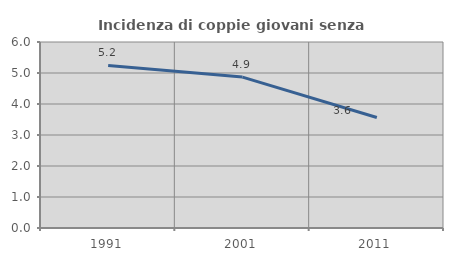
| Category | Incidenza di coppie giovani senza figli |
|---|---|
| 1991.0 | 5.244 |
| 2001.0 | 4.869 |
| 2011.0 | 3.565 |